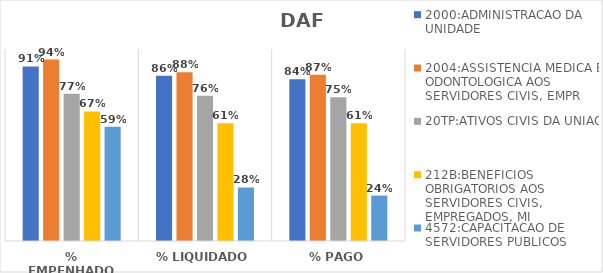
| Category | 2000:ADMINISTRACAO DA UNIDADE | 2004:ASSISTENCIA MEDICA E ODONTOLOGICA AOS SERVIDORES CIVIS, EMPR | 20TP:ATIVOS CIVIS DA UNIAO | 212B:BENEFICIOS OBRIGATORIOS AOS SERVIDORES CIVIS, EMPREGADOS, MI | 4572:CAPACITACAO DE SERVIDORES PUBLICOS FEDERAIS EM PROCESSO DE Q |
|---|---|---|---|---|---|
| % EMPENHADO | 0.909 | 0.945 | 0.767 | 0.675 | 0.594 |
| % LIQUIDADO | 0.861 | 0.879 | 0.757 | 0.613 | 0.279 |
| % PAGO | 0.842 | 0.866 | 0.748 | 0.613 | 0.237 |